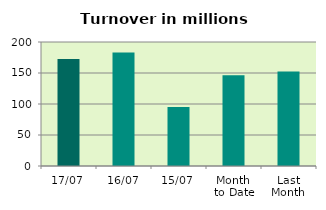
| Category | Series 0 |
|---|---|
| 17/07 | 172.672 |
| 16/07 | 182.895 |
| 15/07 | 95.224 |
| Month 
to Date | 146.484 |
| Last
Month | 152.535 |